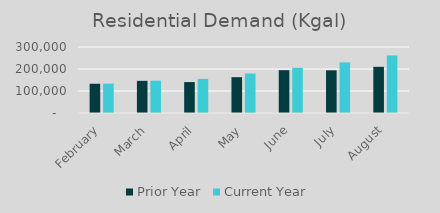
| Category | Prior Year | Current Year |
|---|---|---|
| February | 132905 | 133616 |
| March | 146212 | 146882 |
| April | 140621 | 154955 |
| May | 162790 | 179419 |
| June | 194665 | 205078 |
| July | 194086 | 229973 |
| August | 209888 | 261678 |